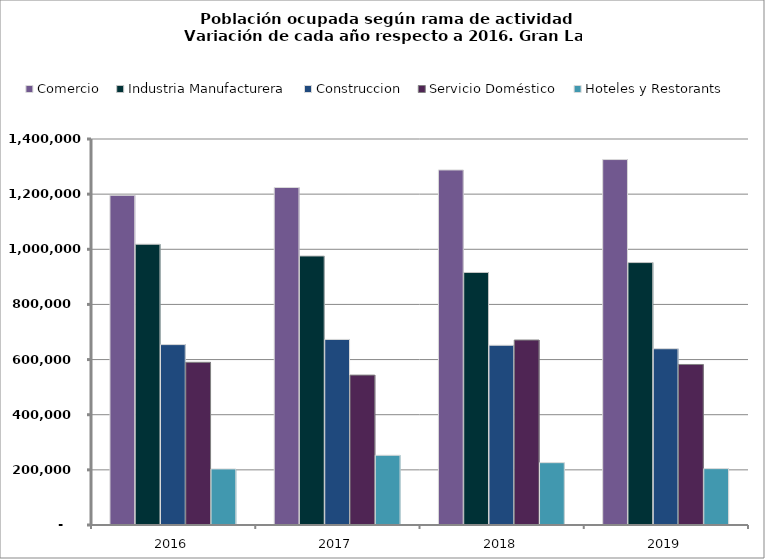
| Category | Comercio | Industria Manufacturera | Construccion | Servicio Doméstico | Hoteles y Restorants |
|---|---|---|---|---|---|
| 2016.0 | 1195792 | 1018254 | 654301 | 590139 | 203348 |
| 2017.0 | 1224060 | 975765 | 673004 | 543692 | 252949 |
| 2018.0 | 1287745 | 915826 | 651949 | 670886 | 226083 |
| 2019.0 | 1325444 | 951831 | 639347 | 582192 | 204465 |